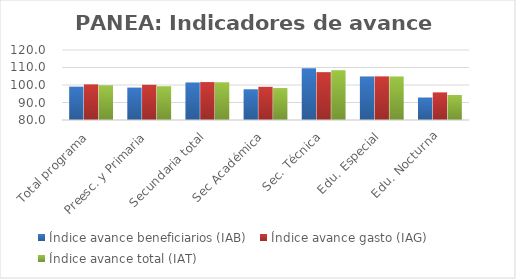
| Category | Índice avance beneficiarios (IAB)  | Índice avance gasto (IAG) | Índice avance total (IAT)  |
|---|---|---|---|
| Total programa | 99.029 | 100.358 | 99.693 |
| Preesc. y Primaria | 98.49 | 100.122 | 99.306 |
| Secundaria total | 101.451 | 101.672 | 101.562 |
| Sec Académica | 97.557 | 98.953 | 98.255 |
| Sec. Técnica | 109.552 | 107.344 | 108.448 |
| Edu. Especial | 104.838 | 104.928 | 104.883 |
| Edu. Nocturna | 92.81 | 95.782 | 94.296 |